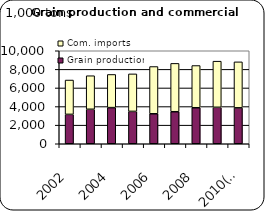
| Category | Grain production | Com. imports |
|---|---|---|
| 2002 | 3158.556 | 3693.664 |
| 2003 | 3707.871 | 3608.171 |
| 2004 | 3885.126 | 3566.967 |
| 2005 | 3478.128 | 4033.682 |
| 2006 | 3223.526 | 5081.133 |
| 2007 | 3443.365 | 5197.879 |
| 2008 | 3871.204 | 4541.017 |
| 2009 | 3918.936 | 4960.563 |
| 2010(e) | 3861 | 4945.685 |